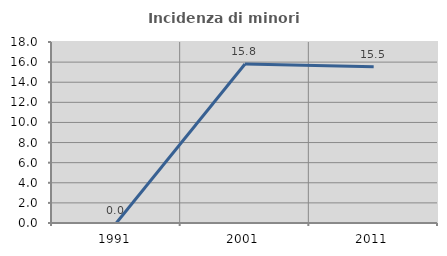
| Category | Incidenza di minori stranieri |
|---|---|
| 1991.0 | 0 |
| 2001.0 | 15.816 |
| 2011.0 | 15.544 |